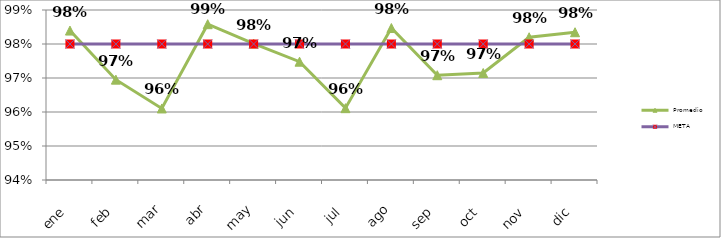
| Category | Promedio | META  |
|---|---|---|
| ene | 0.984 | 0.98 |
| feb | 0.97 | 0.98 |
| mar | 0.961 | 0.98 |
| abr | 0.986 | 0.98 |
| may | 0.98 | 0.98 |
| jun | 0.975 | 0.98 |
| jul | 0.961 | 0.98 |
| ago | 0.985 | 0.98 |
| sep | 0.971 | 0.98 |
| oct | 0.971 | 0.98 |
| nov | 0.982 | 0.98 |
| dic | 0.983 | 0.98 |